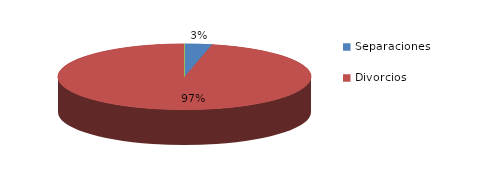
| Category | Series 0 |
|---|---|
| Separaciones | 16 |
| Divorcios | 445 |
| Uniones de hecho | 0 |